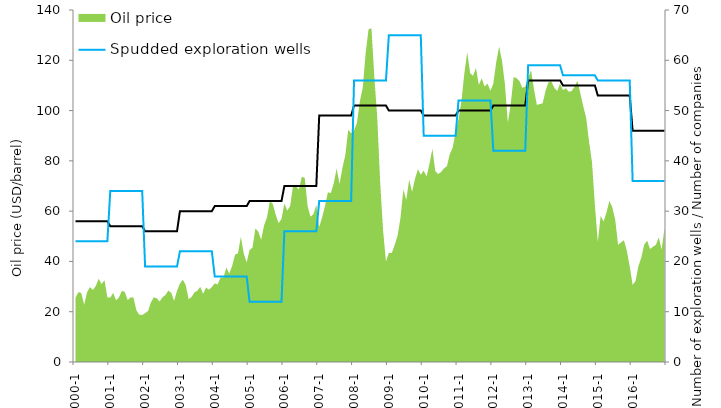
| Category | Number of companies on the shelf | Spudded exploration wells |
|---|---|---|
| 2000-1 | 28 | 24 |
| 2000-2 | 28 | 24 |
| 2000-3 | 28 | 24 |
| 2000-4 | 28 | 24 |
| 2000-5 | 28 | 24 |
| 2000-6 | 28 | 24 |
| 2000-7 | 28 | 24 |
| 2000-8 | 28 | 24 |
| 2000-9 | 28 | 24 |
| 2000-10 | 28 | 24 |
| 2000-11 | 28 | 24 |
| 2000-12 | 28 | 24 |
| 2001-1 | 27 | 34 |
| 2001-2 | 27 | 34 |
| 2001-3 | 27 | 34 |
| 2001-4 | 27 | 34 |
| 2001-5 | 27 | 34 |
| 2001-6 | 27 | 34 |
| 2001-7 | 27 | 34 |
| 2001-8 | 27 | 34 |
| 2001-9 | 27 | 34 |
| 2001-10 | 27 | 34 |
| 2001-11 | 27 | 34 |
| 2001-12 | 27 | 34 |
| 2002-1 | 26 | 19 |
| 2002-2 | 26 | 19 |
| 2002-3 | 26 | 19 |
| 2002-4 | 26 | 19 |
| 2002-5 | 26 | 19 |
| 2002-6 | 26 | 19 |
| 2002-7 | 26 | 19 |
| 2002-8 | 26 | 19 |
| 2002-9 | 26 | 19 |
| 2002-10 | 26 | 19 |
| 2002-11 | 26 | 19 |
| 2002-12 | 26 | 19 |
| 2003-1 | 30 | 22 |
| 2003-2 | 30 | 22 |
| 2003-3 | 30 | 22 |
| 2003-4 | 30 | 22 |
| 2003-5 | 30 | 22 |
| 2003-6 | 30 | 22 |
| 2003-7 | 30 | 22 |
| 2003-8 | 30 | 22 |
| 2003-9 | 30 | 22 |
| 2003-10 | 30 | 22 |
| 2003-11 | 30 | 22 |
| 2003-12 | 30 | 22 |
| 2004-1 | 31 | 17 |
| 2004-2 | 31 | 17 |
| 2004-3 | 31 | 17 |
| 2004-4 | 31 | 17 |
| 2004-5 | 31 | 17 |
| 2004-6 | 31 | 17 |
| 2004-7 | 31 | 17 |
| 2004-8 | 31 | 17 |
| 2004-9 | 31 | 17 |
| 2004-10 | 31 | 17 |
| 2004-11 | 31 | 17 |
| 2004-12 | 31 | 17 |
| 2005-1 | 32 | 12 |
| 2005-2 | 32 | 12 |
| 2005-3 | 32 | 12 |
| 2005-4 | 32 | 12 |
| 2005-5 | 32 | 12 |
| 2005-6 | 32 | 12 |
| 2005-7 | 32 | 12 |
| 2005-8 | 32 | 12 |
| 2005-9 | 32 | 12 |
| 2005-10 | 32 | 12 |
| 2005-11 | 32 | 12 |
| 2005-12 | 32 | 12 |
| 2006-1 | 35 | 26 |
| 2006-2 | 35 | 26 |
| 2006-3 | 35 | 26 |
| 2006-4 | 35 | 26 |
| 2006-5 | 35 | 26 |
| 2006-6 | 35 | 26 |
| 2006-7 | 35 | 26 |
| 2006-8 | 35 | 26 |
| 2006-9 | 35 | 26 |
| 2006-10 | 35 | 26 |
| 2006-11 | 35 | 26 |
| 2006-12 | 35 | 26 |
| 2007-1 | 49 | 32 |
| 2007-2 | 49 | 32 |
| 2007-3 | 49 | 32 |
| 2007-4 | 49 | 32 |
| 2007-5 | 49 | 32 |
| 2007-6 | 49 | 32 |
| 2007-7 | 49 | 32 |
| 2007-8 | 49 | 32 |
| 2007-9 | 49 | 32 |
| 2007-10 | 49 | 32 |
| 2007-11 | 49 | 32 |
| 2007-12 | 49 | 32 |
| 2008-1 | 51 | 56 |
| 2008-2 | 51 | 56 |
| 2008-3 | 51 | 56 |
| 2008-4 | 51 | 56 |
| 2008-5 | 51 | 56 |
| 2008-6 | 51 | 56 |
| 2008-7 | 51 | 56 |
| 2008-8 | 51 | 56 |
| 2008-9 | 51 | 56 |
| 2008-10 | 51 | 56 |
| 2008-11 | 51 | 56 |
| 2008-12 | 51 | 56 |
| 2009-1 | 50 | 65 |
| 2009-2 | 50 | 65 |
| 2009-3 | 50 | 65 |
| 2009-4 | 50 | 65 |
| 2009-5 | 50 | 65 |
| 2009-6 | 50 | 65 |
| 2009-7 | 50 | 65 |
| 2009-8 | 50 | 65 |
| 2009-9 | 50 | 65 |
| 2009-10 | 50 | 65 |
| 2009-11 | 50 | 65 |
| 2009-12 | 50 | 65 |
| 2010-1 | 49 | 45 |
| 2010-2 | 49 | 45 |
| 2010-3 | 49 | 45 |
| 2010-4 | 49 | 45 |
| 2010-5 | 49 | 45 |
| 2010-6 | 49 | 45 |
| 2010-7 | 49 | 45 |
| 2010-8 | 49 | 45 |
| 2010-9 | 49 | 45 |
| 2010-10 | 49 | 45 |
| 2010-11 | 49 | 45 |
| 2010-12 | 49 | 45 |
| 2011-1 | 50 | 52 |
| 2011-2 | 50 | 52 |
| 2011-3 | 50 | 52 |
| 2011-4 | 50 | 52 |
| 2011-5 | 50 | 52 |
| 2011-6 | 50 | 52 |
| 2011-7 | 50 | 52 |
| 2011-8 | 50 | 52 |
| 2011-9 | 50 | 52 |
| 2011-10 | 50 | 52 |
| 2011-11 | 50 | 52 |
| 2011-12 | 50 | 52 |
| 2012-1 | 51 | 42 |
| 2012-2 | 51 | 42 |
| 2012-3 | 51 | 42 |
| 2012-4 | 51 | 42 |
| 2012-5 | 51 | 42 |
| 2012-6 | 51 | 42 |
| 2012-7 | 51 | 42 |
| 2012-8 | 51 | 42 |
| 2012-9 | 51 | 42 |
| 2012-10 | 51 | 42 |
| 2012-11 | 51 | 42 |
| 2012-12 | 51 | 42 |
| 2013-1 | 56 | 59 |
| 2013-2 | 56 | 59 |
| 2013-3 | 56 | 59 |
| 2013-4 | 56 | 59 |
| 2013-5 | 56 | 59 |
| 2013-6 | 56 | 59 |
| 2013-7 | 56 | 59 |
| 2013-8 | 56 | 59 |
| 2013-9 | 56 | 59 |
| 2013-10 | 56 | 59 |
| 2013-11 | 56 | 59 |
| 2013-12 | 56 | 59 |
| 2014-1 | 55 | 57 |
| 2014-2 | 55 | 57 |
| 2014-3 | 55 | 57 |
| 2014-4 | 55 | 57 |
| 2014-5 | 55 | 57 |
| 2014-6 | 55 | 57 |
| 2014-7 | 55 | 57 |
| 2014-8 | 55 | 57 |
| 2014-9 | 55 | 57 |
| 2014-10 | 55 | 57 |
| 2014-11 | 55 | 57 |
| 2014-12 | 55 | 57 |
| 2015-1 | 53 | 56 |
| 2015-2 | 53 | 56 |
| 2015-3 | 53 | 56 |
| 2015-4 | 53 | 56 |
| 2015-5 | 53 | 56 |
| 2015-6 | 53 | 56 |
| 2015-7 | 53 | 56 |
| 2015-8 | 53 | 56 |
| 2015-9 | 53 | 56 |
| 2015-10 | 53 | 56 |
| 2015-11 | 53 | 56 |
| 2015-12 | 53 | 56 |
| 2016-1 | 46 | 36 |
| 2016-2 | 46 | 36 |
| 2016-3 | 46 | 36 |
| 2016-4 | 46 | 36 |
| 2016-5 | 46 | 36 |
| 2016-6 | 46 | 36 |
| 2016-7 | 46 | 36 |
| 2016-8 | 46 | 36 |
| 2016-9 | 46 | 36 |
| 2016-10 | 46 | 36 |
| 2016-11 | 46 | 36 |
| 2016-12 | 46 | 36 |